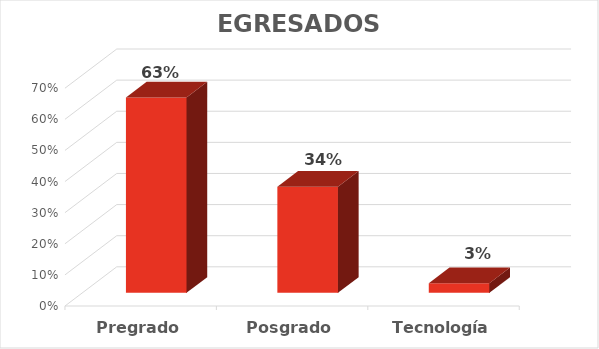
| Category | Porcentaje  |
|---|---|
| Pregrado | 0.628 |
| Posgrado | 0.341 |
| Tecnología | 0.031 |